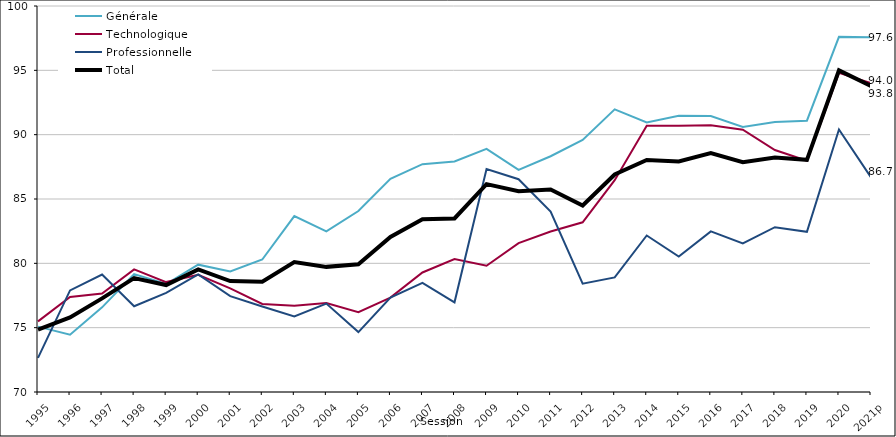
| Category | Générale | Technologique | Professionnelle | Total |
|---|---|---|---|---|
| 1995 | 75.082 | 75.492 | 72.657 | 74.856 |
| 1996 | 74.45 | 77.383 | 77.895 | 75.798 |
| 1997 | 76.578 | 77.654 | 79.127 | 77.277 |
| 1998 | 79.164 | 79.529 | 76.669 | 78.851 |
| 1999 | 78.39 | 78.542 | 77.705 | 78.314 |
| 2000 | 79.897 | 79.116 | 79.147 | 79.53 |
| 2001 | 79.369 | 78.056 | 77.454 | 78.617 |
| 2002 | 80.297 | 76.838 | 76.645 | 78.57 |
| 2003 | 83.669 | 76.703 | 75.876 | 80.104 |
| 2004 | 82.477 | 76.92 | 76.873 | 79.725 |
| 2005 | 84.065 | 76.211 | 74.657 | 79.921 |
| 2006 | 86.566 | 77.333 | 77.333 | 82.056 |
| 2007 | 87.704 | 79.291 | 78.487 | 83.419 |
| 2008 | 87.917 | 80.33 | 76.969 | 83.488 |
| 2009 | 88.898 | 79.81 | 87.33 | 86.156 |
| 2010 | 87.259 | 81.567 | 86.538 | 85.601 |
| 2011 | 88.324 | 82.478 | 84.017 | 85.74 |
| 2012 | 89.595 | 83.189 | 78.423 | 84.492 |
| 2013 | 91.964 | 86.466 | 78.908 | 86.909 |
| 2014 | 90.953 | 90.702 | 82.162 | 88.031 |
| 2015 | 91.477 | 90.699 | 80.522 | 87.91 |
| 2016 | 91.452 | 90.724 | 82.48 | 88.575 |
| 2017 | 90.592 | 90.385 | 81.546 | 87.863 |
| 2018 | 90.979 | 88.808 | 82.806 | 88.233 |
| 2019 | 91.084 | 87.969 | 82.45 | 88.043 |
| 2020 | 97.6 | 94.8 | 90.4 | 95 |
| 2021p | 97.573 | 93.997 | 86.681 | 93.778 |